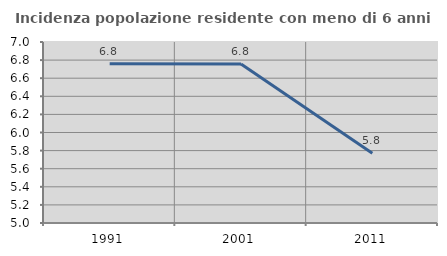
| Category | Incidenza popolazione residente con meno di 6 anni |
|---|---|
| 1991.0 | 6.759 |
| 2001.0 | 6.757 |
| 2011.0 | 5.771 |